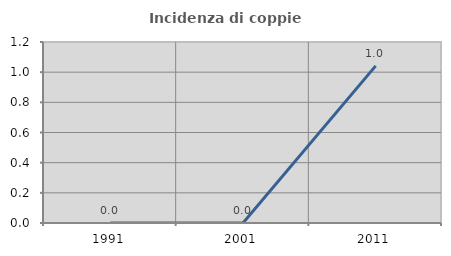
| Category | Incidenza di coppie miste |
|---|---|
| 1991.0 | 0 |
| 2001.0 | 0 |
| 2011.0 | 1.042 |